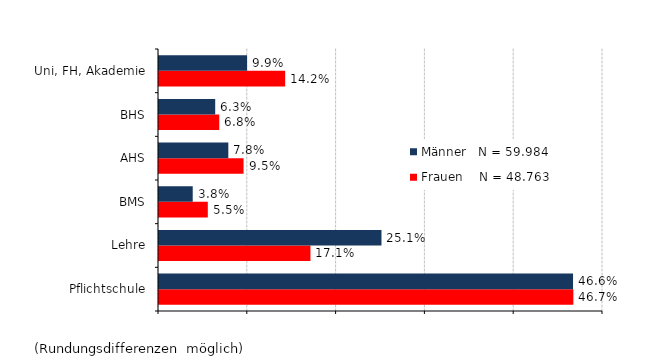
| Category | Frauen    N = 48.763 | Männer   N = 59.984 |
|---|---|---|
| Pflichtschule | 0.467 | 0.466 |
| Lehre | 0.171 | 0.251 |
| BMS | 0.055 | 0.038 |
| AHS | 0.095 | 0.078 |
| BHS | 0.068 | 0.063 |
| Uni, FH, Akademie | 0.142 | 0.099 |